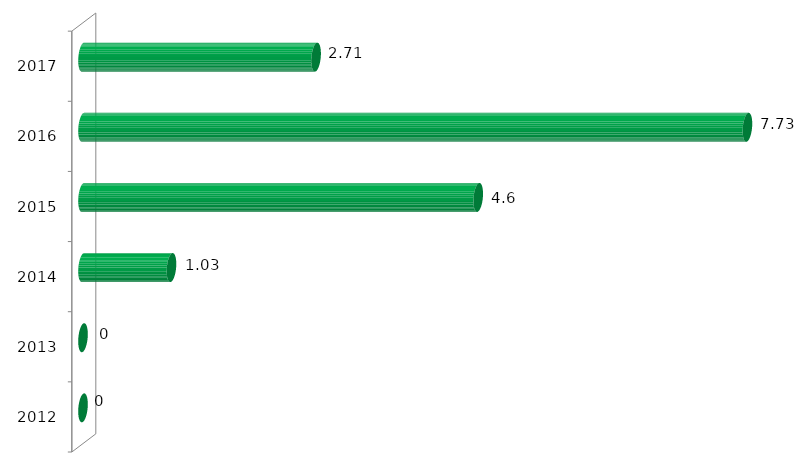
| Category | Vagas ofertadas |
|---|---|
| 2012.0 | 0 |
| 2013.0 | 0 |
| 2014.0 | 1.03 |
| 2015.0 | 4.6 |
| 2016.0 | 7.733 |
| 2017.0 | 2.713 |